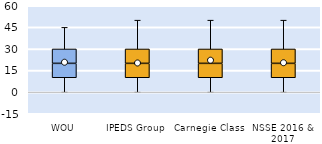
| Category | 25th | 50th | 75th |
|---|---|---|---|
| WOU | 10 | 10 | 10 |
| IPEDS Group | 10 | 10 | 10 |
| Carnegie Class | 10 | 10 | 10 |
| NSSE 2016 & 2017 | 10 | 10 | 10 |